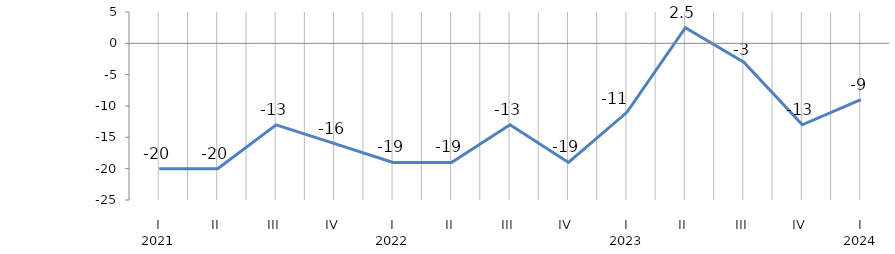
| Category | Индекс предпринимательской уверенности |
|---|---|
| 0 | -20 |
| 1 | -20 |
| 2 | -13 |
| 3 | -16 |
| 4 | -19 |
| 5 | -19 |
| 6 | -13 |
| 7 | -19 |
| 8 | -11 |
| 9 | 2.5 |
| 10 | -3 |
| 11 | -13 |
| 12 | -9 |